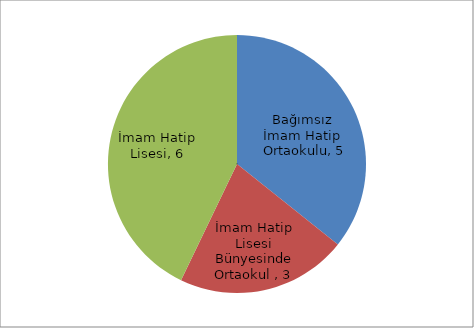
| Category | Series 0 |
|---|---|
| Bağımsız  İmam Hatip  Ortaokulu | 5 |
| İmam Hatip Lisesi Bünyesinde Ortaokul  | 3 |
| İmam Hatip Lisesi | 6 |